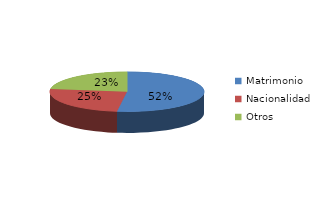
| Category | Series 0 |
|---|---|
| Matrimonio | 1744 |
| Nacionalidad | 845 |
| Otros | 762 |